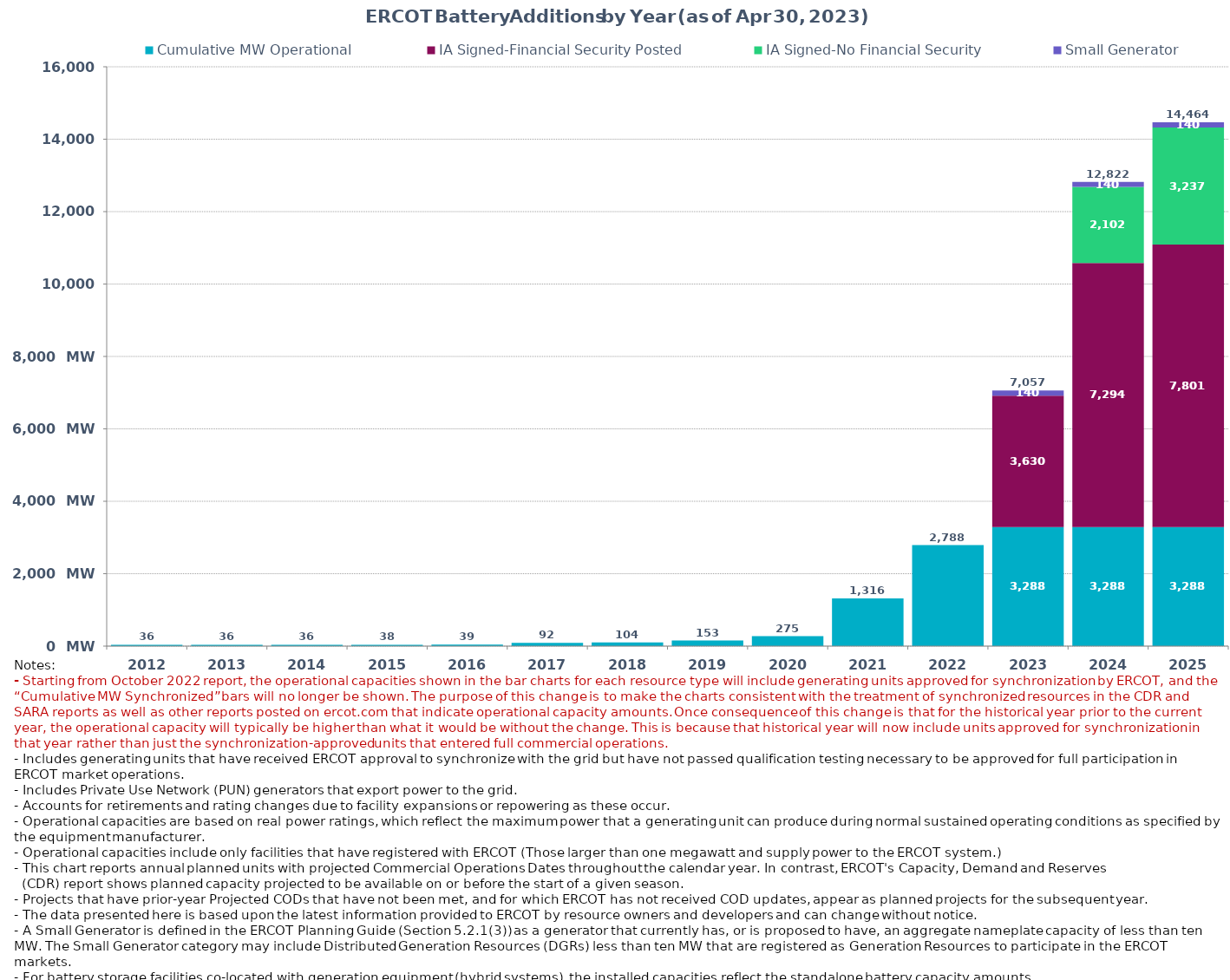
| Category | Cumulative MW Operational  | IA Signed-Financial Security Posted  | IA Signed-No Financial Security  | Small Generator | Cumulative Installed and Planned |
|---|---|---|---|---|---|
| 2012.0 | 36 | 0 | 0 | 0 | 36 |
| 2013.0 | 36 | 0 | 0 | 0 | 36 |
| 2014.0 | 36 | 0 | 0 | 0 | 36 |
| 2015.0 | 38 | 0 | 0 | 0 | 38 |
| 2016.0 | 39 | 0 | 0 | 0 | 39 |
| 2017.0 | 92.3 | 0 | 0 | 0 | 92.3 |
| 2018.0 | 103.7 | 0 | 0 | 0 | 103.7 |
| 2019.0 | 153.3 | 0 | 0 | 0 | 153.3 |
| 2020.0 | 275.4 | 0 | 0 | 0 | 275.4 |
| 2021.0 | 1316.43 | 0 | 0 | 0 | 1316.43 |
| 2022.0 | 2787.86 | 0 | 0 | 0 | 2787.86 |
| 2023.0 | 3287.56 | 3630.17 | 0 | 139.65 | 7057.38 |
| 2024.0 | 3287.56 | 7293.75 | 2101.5 | 139.65 | 12822.46 |
| 2025.0 | 3287.56 | 7800.67 | 3236.56 | 139.65 | 14464.44 |